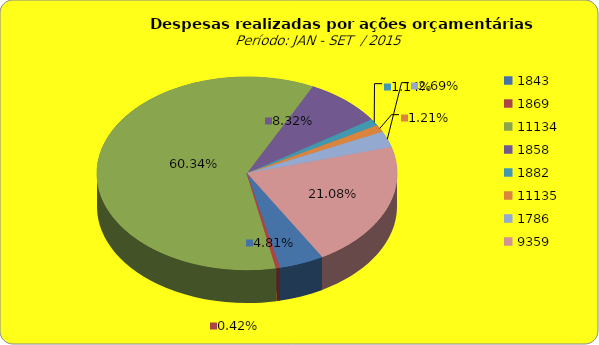
| Category | Series 1 |
|---|---|
| 1843.0 | 8197055.96 |
| 1869.0 | 708217.51 |
| 11134.0 | 102924491.44 |
| 1858.0 | 14193972.74 |
| 1882.0 | 1948763.89 |
| 11135.0 | 2070210.39 |
| 1786.0 | 4582185.75 |
| 9359.0 | 35959940.98 |